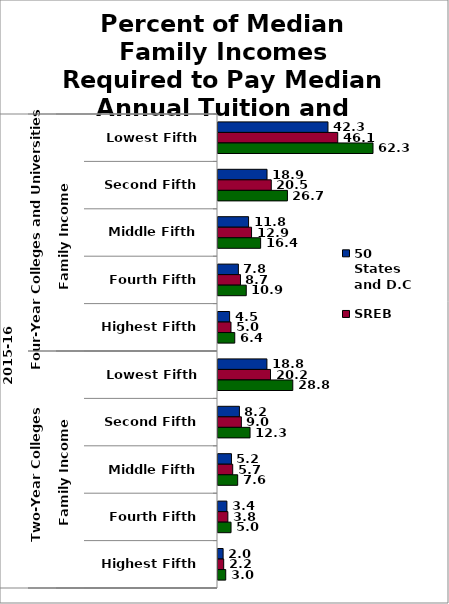
| Category | 50 States and D.C. | SREB states | State |
|---|---|---|---|
| 0 | 42.296 | 46.057 | 62.308 |
| 1 | 18.854 | 20.49 | 26.703 |
| 2 | 11.756 | 12.908 | 16.397 |
| 3 | 7.837 | 8.652 | 10.868 |
| 4 | 4.466 | 4.998 | 6.443 |
| 5 | 18.812 | 20.198 | 28.764 |
| 6 | 8.239 | 8.986 | 12.327 |
| 7 | 5.177 | 5.661 | 7.569 |
| 8 | 3.424 | 3.794 | 5.017 |
| 9 | 1.968 | 2.192 | 2.974 |